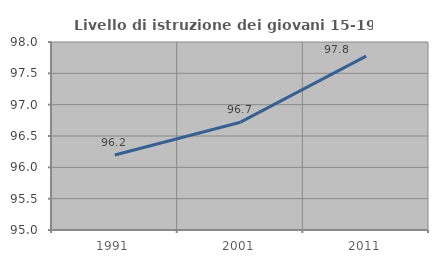
| Category | Livello di istruzione dei giovani 15-19 anni |
|---|---|
| 1991.0 | 96.196 |
| 2001.0 | 96.721 |
| 2011.0 | 97.774 |